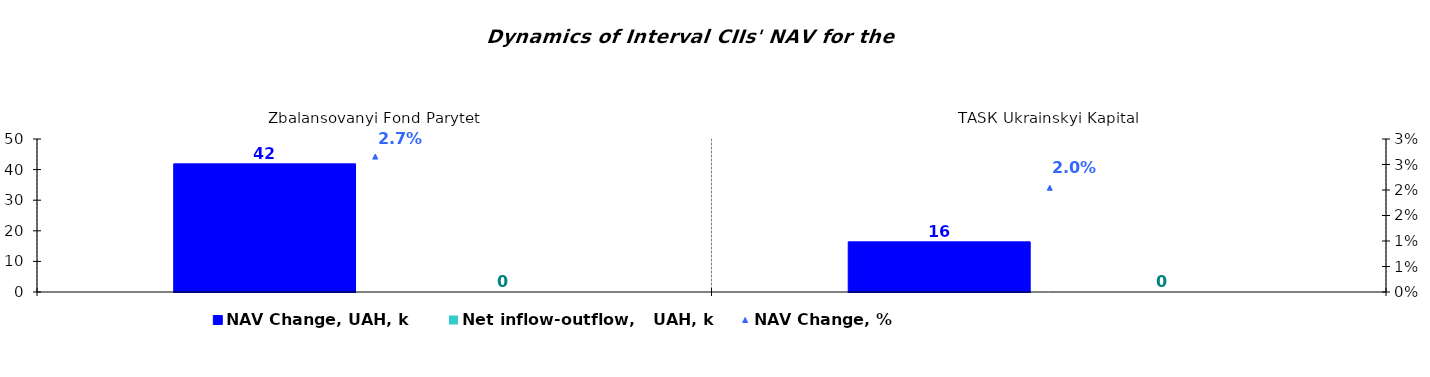
| Category | NAV Change, UAH, k | Net inflow-outflow,   UAH, k |
|---|---|---|
| Zbalansovanyi Fond Parytet | 41.873 | 0 |
| ТАSК Ukrainskyi Kapital | 16.381 | 0 |